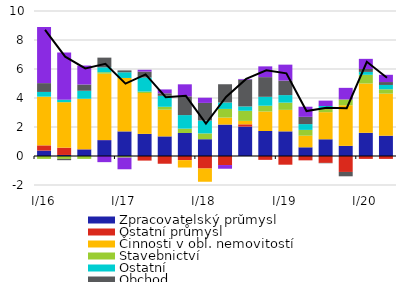
| Category | Zpracovatelský průmysl | Ostatní průmysl | Činnosti v obl. nemovitostí | Stavebnictví | Ostatní | Obchod | Služby  |
|---|---|---|---|---|---|---|---|
| I/16 | 0.372 | 0.362 | 3.359 | -0.2 | 0.325 | 0.608 | 3.869 |
| II | 0.072 | 0.502 | 3.138 | -0.2 | 0.17 | -0.089 | 3.256 |
| III | 0.454 | 0.013 | 3.483 | -0.2 | 0.549 | 0.432 | 1.308 |
| IV | 1.093 | 0.006 | 4.578 | 0.1 | 0.338 | 0.669 | -0.424 |
| I/17 | 1.697 | -0.007 | 3.685 | -0.1 | 0.393 | 0.129 | -0.807 |
| II | 1.525 | -0.317 | 2.819 | 0.1 | 0.964 | 0.413 | 0.125 |
| III | 1.353 | -0.534 | 1.841 | 0.2 | 0.758 | 0.173 | 0.267 |
| IV | 1.588 | -0.285 | -0.51 | 0.3 | 0.934 | 1.291 | 0.831 |
| I/18 | 1.158 | -0.865 | -0.911 | 0.4 | 0.888 | 1.216 | 0.357 |
| II | 2.167 | -0.624 | 0.481 | 0.6 | 0.442 | 1.258 | -0.254 |
| III | 2.025 | 0.159 | 0.235 | 0.7 | 0.299 | 1.841 | 0.054 |
| IV | 1.724 | -0.266 | 1.343 | 0.4 | 0.615 | 1.358 | 0.742 |
| I/19 | 1.7 | -0.6 | 1.481 | 0.5 | 0.519 | 1 | 1.1 |
| II | 0.6 | -0.3 | 0.8 | 0.4 | 0.4 | 0.5 | 0.7 |
| III | 1.154 | -0.475 | 1.869 | 0.244 | 0.181 | -0.024 | 0.372 |
| IV | 0.7 | -1.1 | 2.8 | 0.4 | 0 | -0.3 | 0.8 |
| I/20 | 1.6 | -0.2 | 3.4 | 0.6 | 0.2 | 0.2 | 0.7 |
| II | 1.4 | -0.2 | 2.9 | 0.3 | 0.3 | 0.2 | 0.5 |